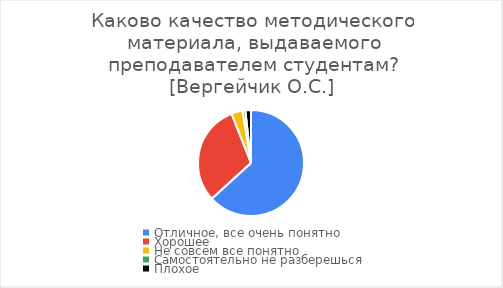
| Category | Series 0 |
|---|---|
| Отличное, все очень понятно | 74 |
| Хорошее | 36 |
| Не совсем все понятно | 4 |
| Самостоятельно не разберешься | 1 |
| Плохое | 2 |